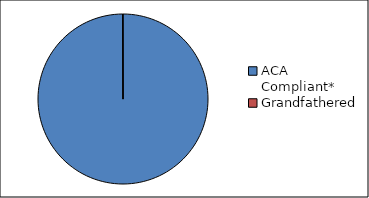
| Category | Series 0 |
|---|---|
| ACA
Compliant* | 155774 |
| Grandfathered | 111 |